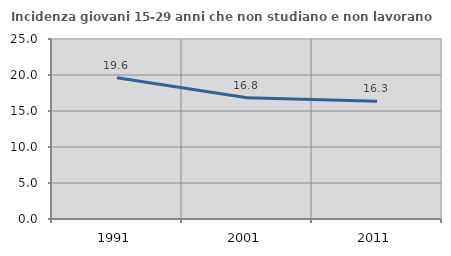
| Category | Incidenza giovani 15-29 anni che non studiano e non lavorano  |
|---|---|
| 1991.0 | 19.623 |
| 2001.0 | 16.83 |
| 2011.0 | 16.341 |